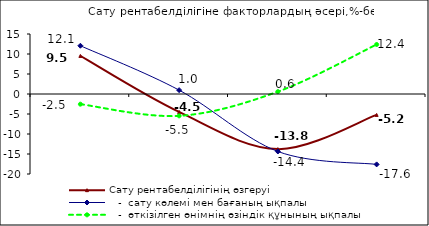
| Category | Сату рентабелділігінің өзгеруі |    -  сату көлемі мен бағаның ықпалы |    -  өткізілген өнімнің өзіндік құнының ықпалы |
|---|---|---|---|
| 0 | 9.522 | 12.066 | -2.544 |
| 1 | -4.492 | 0.968 | -5.46 |
| 2 | -13.781 | -14.368 | 0.587 |
| 3 | -5.228 | -17.6 | 12.372 |